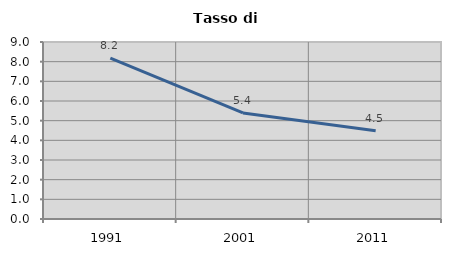
| Category | Tasso di disoccupazione   |
|---|---|
| 1991.0 | 8.183 |
| 2001.0 | 5.393 |
| 2011.0 | 4.491 |